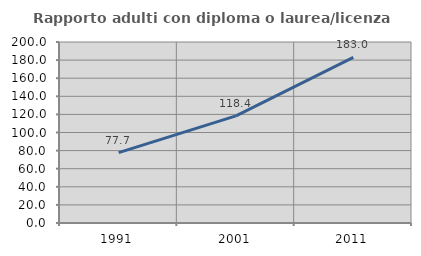
| Category | Rapporto adulti con diploma o laurea/licenza media  |
|---|---|
| 1991.0 | 77.732 |
| 2001.0 | 118.401 |
| 2011.0 | 182.969 |